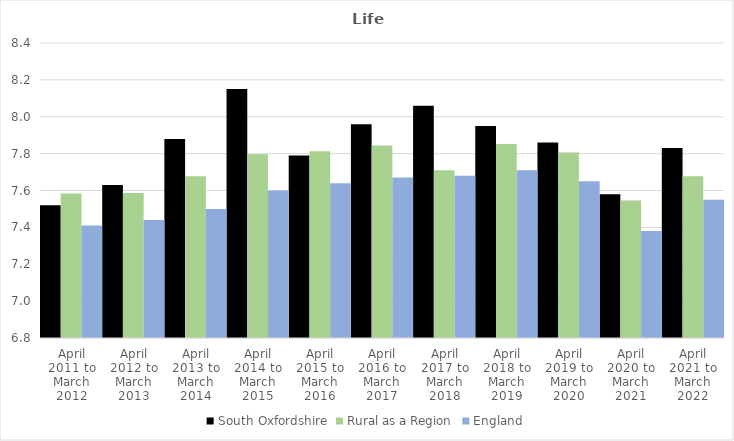
| Category | South Oxfordshire | Rural as a Region | England |
|---|---|---|---|
| April 2011 to March 2012 | 7.52 | 7.584 | 7.41 |
| April 2012 to March 2013 | 7.63 | 7.586 | 7.44 |
| April 2013 to March 2014 | 7.88 | 7.677 | 7.5 |
| April 2014 to March 2015 | 8.15 | 7.797 | 7.6 |
| April 2015 to March 2016 | 7.79 | 7.813 | 7.64 |
| April 2016 to March 2017 | 7.96 | 7.845 | 7.67 |
| April 2017 to March 2018 | 8.06 | 7.71 | 7.68 |
| April 2018 to March 2019 | 7.95 | 7.852 | 7.71 |
| April 2019 to March 2020 | 7.86 | 7.806 | 7.65 |
| April 2020 to March 2021 | 7.58 | 7.546 | 7.38 |
| April 2021 to March 2022 | 7.83 | 7.677 | 7.55 |